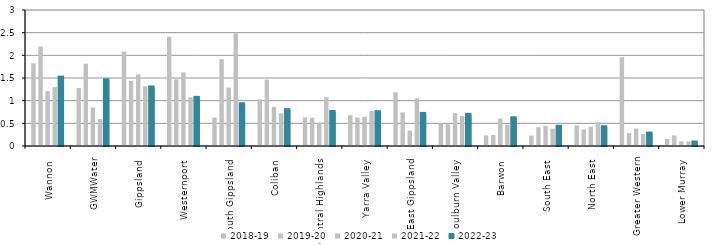
| Category | 2018-19 | 2019-20 | 2020-21 | 2021-22 | 2022-23 |
|---|---|---|---|---|---|
| Wannon  | 1.824 | 2.194 | 1.211 | 1.3 | 1.508 |
| GWMWater | 1.28 | 1.815 | 0.851 | 0.597 | 1.45 |
| Gippsland  | 2.084 | 1.436 | 1.581 | 1.315 | 1.292 |
| Westernport  | 2.411 | 1.472 | 1.623 | 1.075 | 1.062 |
| South Gippsland  | 0.625 | 1.915 | 1.289 | 2.483 | 0.92 |
| Coliban  | 1.03 | 1.465 | 0.864 | 0.721 | 0.792 |
| Central Highlands  | 0.63 | 0.626 | 0.516 | 1.078 | 0.751 |
| Yarra Valley  | 0.681 | 0.629 | 0.643 | 0.771 | 0.746 |
| East Gippsland  | 1.187 | 0.743 | 0.34 | 1.052 | 0.708 |
| Goulburn Valley  | 0.499 | 0.481 | 0.726 | 0.661 | 0.688 |
| Barwon  | 0.234 | 0.245 | 0.608 | 0.472 | 0.611 |
| South East  | 0.229 | 0.417 | 0.44 | 0.385 | 0.425 |
| North East  | 0.454 | 0.364 | 0.424 | 0.526 | 0.414 |
| Greater Western | 1.957 | 0.284 | 0.385 | 0.264 | 0.275 |
| Lower Murray  | 0.155 | 0.232 | 0.102 | 0.102 | 0.076 |